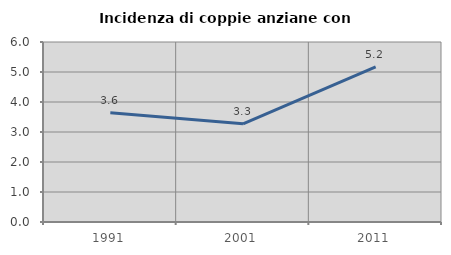
| Category | Incidenza di coppie anziane con figli |
|---|---|
| 1991.0 | 3.642 |
| 2001.0 | 3.274 |
| 2011.0 | 5.172 |